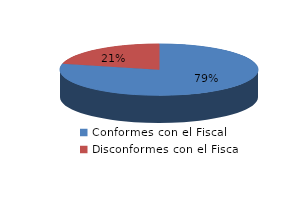
| Category | Series 0 |
|---|---|
| 0 | 178 |
| 1 | 48 |